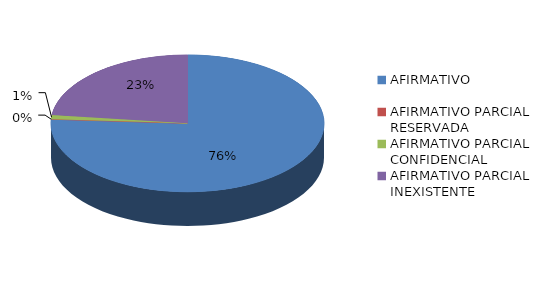
| Category | Series 0 |
|---|---|
| AFIRMATIVO | 79 |
| AFIRMATIVO PARCIAL RESERVADA | 0 |
| AFIRMATIVO PARCIAL CONFIDENCIAL | 1 |
| AFIRMATIVO PARCIAL INEXISTENTE | 24 |